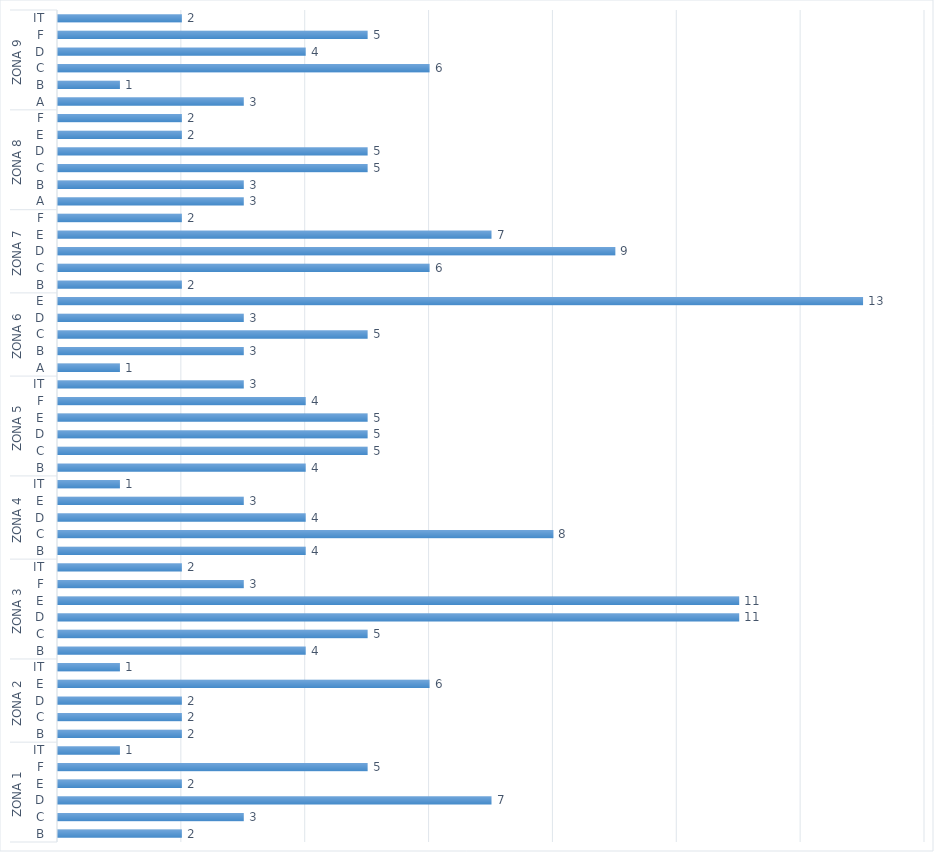
| Category | Total |
|---|---|
| 0 | 2 |
| 1 | 3 |
| 2 | 7 |
| 3 | 2 |
| 4 | 5 |
| 5 | 1 |
| 6 | 2 |
| 7 | 2 |
| 8 | 2 |
| 9 | 6 |
| 10 | 1 |
| 11 | 4 |
| 12 | 5 |
| 13 | 11 |
| 14 | 11 |
| 15 | 3 |
| 16 | 2 |
| 17 | 4 |
| 18 | 8 |
| 19 | 4 |
| 20 | 3 |
| 21 | 1 |
| 22 | 4 |
| 23 | 5 |
| 24 | 5 |
| 25 | 5 |
| 26 | 4 |
| 27 | 3 |
| 28 | 1 |
| 29 | 3 |
| 30 | 5 |
| 31 | 3 |
| 32 | 13 |
| 33 | 2 |
| 34 | 6 |
| 35 | 9 |
| 36 | 7 |
| 37 | 2 |
| 38 | 3 |
| 39 | 3 |
| 40 | 5 |
| 41 | 5 |
| 42 | 2 |
| 43 | 2 |
| 44 | 3 |
| 45 | 1 |
| 46 | 6 |
| 47 | 4 |
| 48 | 5 |
| 49 | 2 |